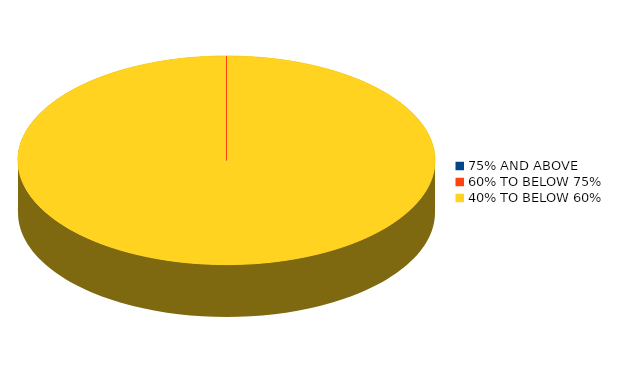
| Category | Number of students |
|---|---|
| 75% AND ABOVE | 0 |
| 60% TO BELOW 75% | 0 |
| 40% TO BELOW 60% | 3 |